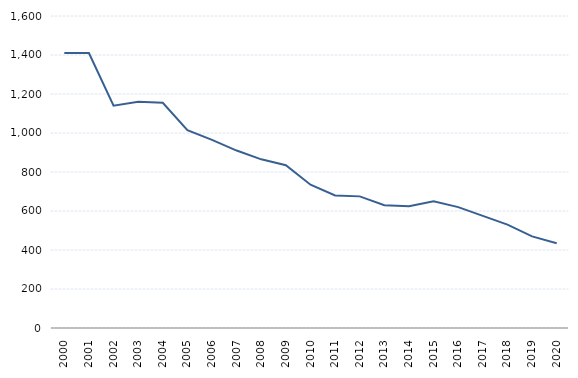
| Category | Series 1 |
|---|---|
| 2000.0 | 1410 |
| 2001.0 | 1410 |
| 2002.0 | 1140 |
| 2003.0 | 1160 |
| 2004.0 | 1155 |
| 2005.0 | 1015 |
| 2006.0 | 965 |
| 2007.0 | 910 |
| 2008.0 | 865 |
| 2009.0 | 835 |
| 2010.0 | 735 |
| 2011.0 | 680 |
| 2012.0 | 675 |
| 2013.0 | 630 |
| 2014.0 | 625 |
| 2015.0 | 650 |
| 2016.0 | 620 |
| 2017.0 | 575 |
| 2018.0 | 530 |
| 2019.0 | 470 |
| 2020.0 | 435 |